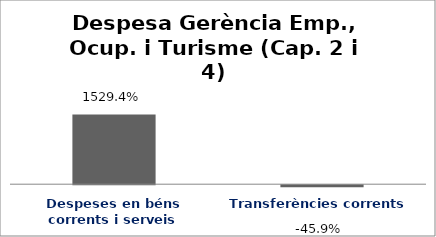
| Category | Series 0 |
|---|---|
| Despeses en béns corrents i serveis | 15.294 |
| Transferències corrents | -0.459 |